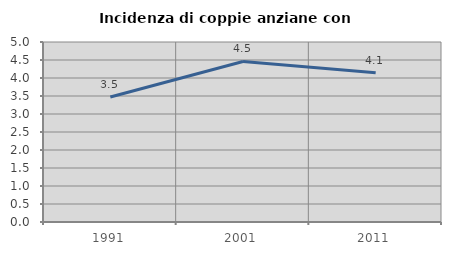
| Category | Incidenza di coppie anziane con figli |
|---|---|
| 1991.0 | 3.471 |
| 2001.0 | 4.46 |
| 2011.0 | 4.145 |